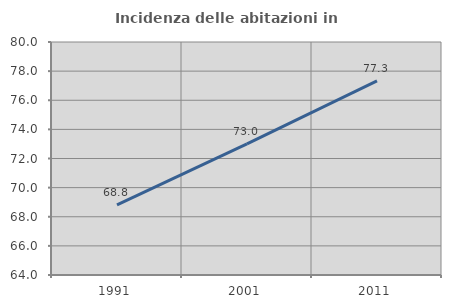
| Category | Incidenza delle abitazioni in proprietà  |
|---|---|
| 1991.0 | 68.811 |
| 2001.0 | 73.004 |
| 2011.0 | 77.337 |